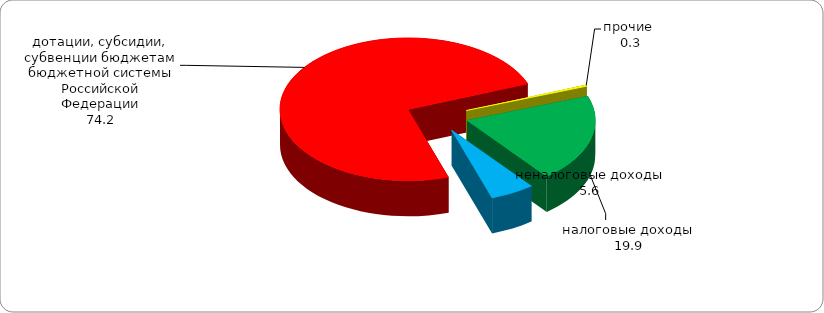
| Category | Series 0 |
|---|---|
| налоговые доходы | 19.861 |
| неналоговые доходы | 5.58 |
| дотации, субсидии, субвенции бюджетам бюджетной системы Российской Федерации | 74.204 |
| прочие  | 0.3 |